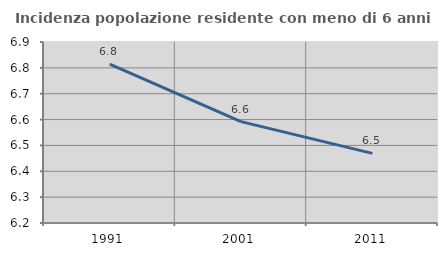
| Category | Incidenza popolazione residente con meno di 6 anni |
|---|---|
| 1991.0 | 6.814 |
| 2001.0 | 6.592 |
| 2011.0 | 6.469 |